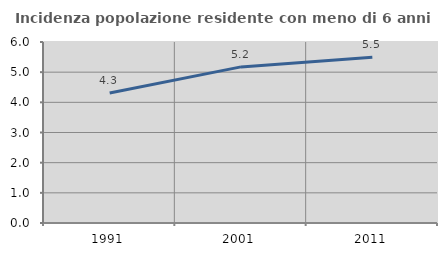
| Category | Incidenza popolazione residente con meno di 6 anni |
|---|---|
| 1991.0 | 4.312 |
| 2001.0 | 5.175 |
| 2011.0 | 5.496 |